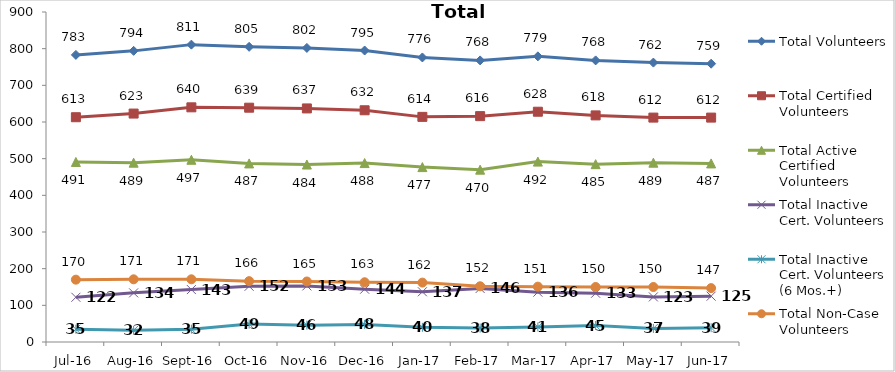
| Category | Total Volunteers | Total Certified Volunteers | Total Active Certified Volunteers | Total Inactive Cert. Volunteers | Total Inactive Cert. Volunteers (6 Mos.+) | Total Non-Case Volunteers |
|---|---|---|---|---|---|---|
| Jul-16 | 783 | 613 | 491 | 122 | 35 | 170 |
| Aug-16 | 794 | 623 | 489 | 134 | 32 | 171 |
| Sep-16 | 811 | 640 | 497 | 143 | 35 | 171 |
| Oct-16 | 805 | 639 | 487 | 152 | 49 | 166 |
| Nov-16 | 802 | 637 | 484 | 153 | 46 | 165 |
| Dec-16 | 795 | 632 | 488 | 144 | 48 | 163 |
| Jan-17 | 776 | 614 | 477 | 137 | 40 | 162 |
| Feb-17 | 768 | 616 | 470 | 146 | 38 | 152 |
| Mar-17 | 779 | 628 | 492 | 136 | 41 | 151 |
| Apr-17 | 768 | 618 | 485 | 133 | 45 | 150 |
| May-17 | 762 | 612 | 489 | 123 | 37 | 150 |
| Jun-17 | 759 | 612 | 487 | 125 | 39 | 147 |